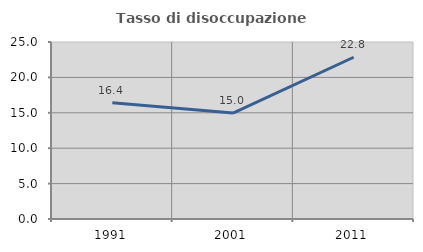
| Category | Tasso di disoccupazione giovanile  |
|---|---|
| 1991.0 | 16.418 |
| 2001.0 | 14.968 |
| 2011.0 | 22.845 |